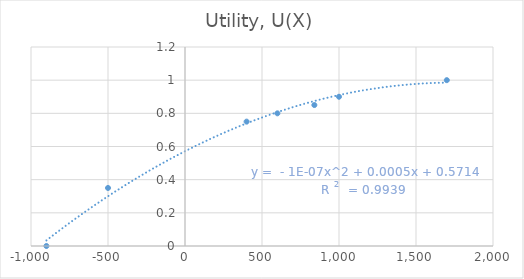
| Category | Utility, U(X) |
|---|---|
| 1700.0 | 1 |
| 1000.0 | 0.9 |
| 840.0 | 0.85 |
| 600.0 | 0.8 |
| 400.0 | 0.75 |
| -500.0 | 0.35 |
| -900.0 | 0 |